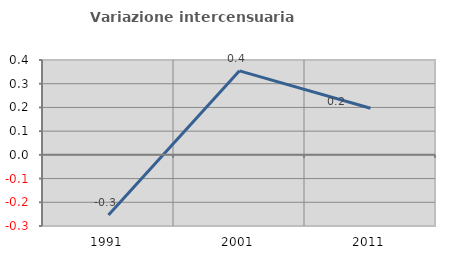
| Category | Variazione intercensuaria annua |
|---|---|
| 1991.0 | -0.253 |
| 2001.0 | 0.354 |
| 2011.0 | 0.197 |